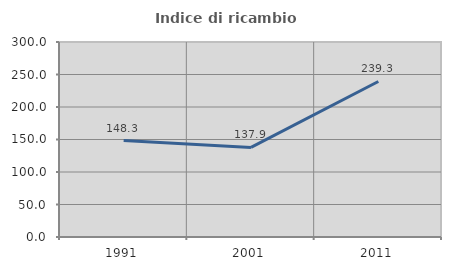
| Category | Indice di ricambio occupazionale  |
|---|---|
| 1991.0 | 148.276 |
| 2001.0 | 137.879 |
| 2011.0 | 239.286 |